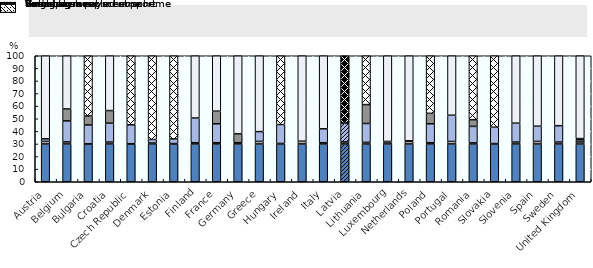
| Category | Greening | Young farmer | Voluntary coupled support | Redistributive | Basic payment scheme | Single area payment scheme |
|---|---|---|---|---|---|---|
| Austria | 30 | 2 | 2.1 | 0 | 65.9 | 0 |
| Belgium | 30 | 1.6 | 16.7 | 9.5 | 42.2 | 0 |
| Bulgaria | 30 | 0.1 | 15 | 7.1 | 0 | 47.8 |
| Croatia | 30 | 1.5 | 15 | 10 | 43.5 | 0 |
| Czech Republic | 30 | 0.2 | 15 | 0 | 0 | 54.8 |
| Denmark | 30.12 | 0.602 | 2.811 | 0 | 0 | 66.466 |
| Estonia | 30 | 0.3 | 3.7 | 0 | 0 | 66 |
| Finland | 30 | 1 | 19.6 | 0 | 49.4 | 0 |
| France | 30 | 1 | 15 | 10 | 44 | 0 |
| Germany | 30 | 1 | 0 | 7 | 62 | 0 |
| Greece | 30 | 2 | 7.8 | 0 | 60.2 | 0 |
| Hungary | 30 | 0.4 | 15 | 0 | 0 | 54.6 |
| Ireland | 30 | 2 | 0.2 | 0 | 67.8 | 0 |
| Italy | 30 | 1 | 11 | 0 | 58 | 0 |
| Latvia | 30 | 1.6 | 15 | 0 | 0 | 53.4 |
| Lithuania | 29.97 | 1.299 | 14.985 | 14.985 | 0 | 38.761 |
| Luxembourg | 30 | 1.5 | 0.5 | 0 | 68 | 0 |
| Netherlands | 30 | 2 | 0.5 | 0 | 67.5 | 0 |
| Poland | 30 | 1 | 15 | 8.3 | 0 | 45.7 |
| Portugal | 30 | 2 | 20.8 | 0 | 47.2 | 0 |
| Romania | 30.03 | 0.801 | 13.113 | 5.305 | 0 | 50.751 |
| Slovakia | 30 | 0.3 | 13 | 0 | 0 | 56.7 |
| Slovenia | 30 | 1.5 | 15 | 0 | 53.5 | 0 |
| Spain | 30 | 2 | 12.1 | 0 | 55.9 | 0 |
| Sweden | 30 | 1.5 | 13 | 0 | 55.5 | 0 |
| United Kingdom | 29.97 | 1.598 | 1.698 | 0.999 | 65.734 | 0 |